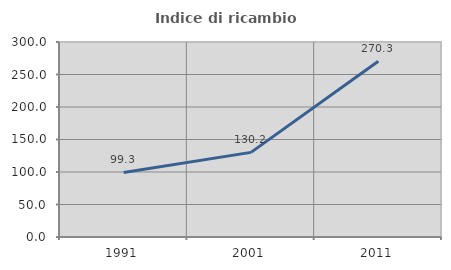
| Category | Indice di ricambio occupazionale  |
|---|---|
| 1991.0 | 99.333 |
| 2001.0 | 130.189 |
| 2011.0 | 270.27 |